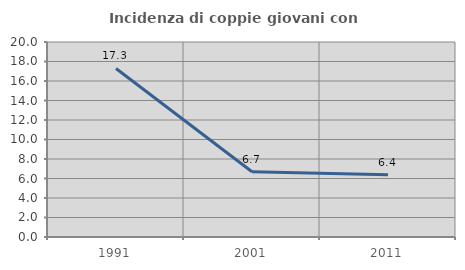
| Category | Incidenza di coppie giovani con figli |
|---|---|
| 1991.0 | 17.284 |
| 2001.0 | 6.693 |
| 2011.0 | 6.375 |